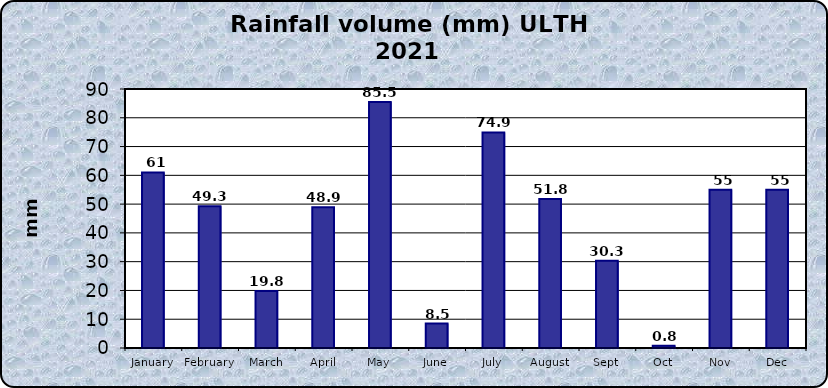
| Category | Series 0 |
|---|---|
| January | 61 |
| February | 49.3 |
| March | 19.8 |
| April | 48.9 |
| May | 85.5 |
| June | 8.5 |
| July | 74.9 |
| August | 51.8 |
| Sept | 30.3 |
| Oct | 0.8 |
| Nov | 55 |
| Dec | 55 |